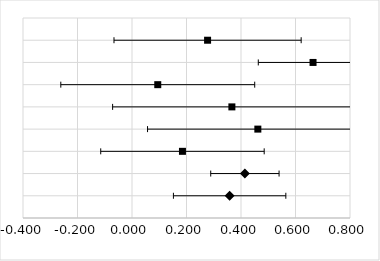
| Category | Series 0 |
|---|---|
| 0.27735640148036095 | 8 |
| 0.6643850998911356 | 7 |
| 0.0945243733606383 | 6 |
| 0.3665463484579782 | 5 |
| 0.46180797677414176 | 4 |
| 0.18516464424648887 | 3 |
| 0.41428749075789617 | 2 |
| 0.3582345748384818 | 1 |